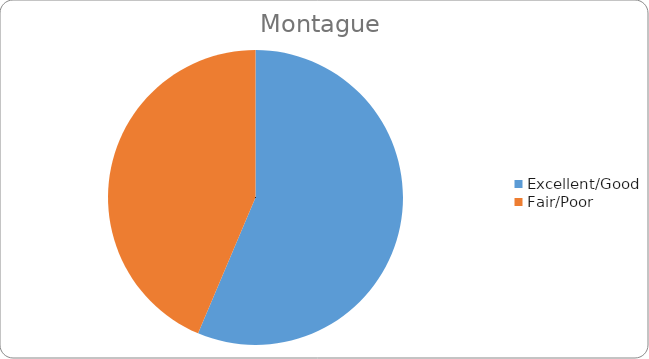
| Category | Series 0 |
|---|---|
| Excellent/Good | 62 |
| Fair/Poor | 48 |